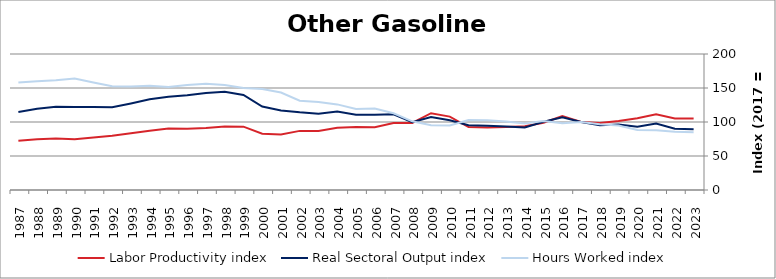
| Category | Labor Productivity index | Real Sectoral Output index | Hours Worked index |
|---|---|---|---|
| 2023.0 | 105.082 | 89.369 | 85.048 |
| 2022.0 | 105.326 | 90.136 | 85.578 |
| 2021.0 | 111.449 | 97.855 | 87.802 |
| 2020.0 | 105.673 | 93.113 | 88.114 |
| 2019.0 | 101.478 | 96.333 | 94.93 |
| 2018.0 | 98.571 | 95.359 | 96.741 |
| 2017.0 | 100 | 100 | 100 |
| 2016.0 | 108.844 | 106.803 | 98.125 |
| 2015.0 | 98.941 | 100.356 | 101.43 |
| 2014.0 | 93.907 | 91.929 | 97.894 |
| 2013.0 | 92.495 | 93.322 | 100.895 |
| 2012.0 | 92.034 | 94.338 | 102.503 |
| 2011.0 | 92.594 | 95.32 | 102.945 |
| 2010.0 | 107.949 | 102.577 | 95.023 |
| 2009.0 | 112.909 | 107.35 | 95.077 |
| 2008.0 | 98.693 | 99.652 | 100.972 |
| 2007.0 | 98.588 | 111.229 | 112.822 |
| 2006.0 | 92.355 | 110.746 | 119.913 |
| 2005.0 | 92.795 | 110.518 | 119.099 |
| 2004.0 | 91.543 | 115.253 | 125.9 |
| 2003.0 | 86.612 | 112.218 | 129.564 |
| 2002.0 | 86.943 | 114.243 | 131.399 |
| 2001.0 | 81.604 | 116.98 | 143.351 |
| 2000.0 | 82.723 | 122.774 | 148.415 |
| 1999.0 | 93.133 | 139.84 | 150.151 |
| 1998.0 | 93.453 | 144.384 | 154.498 |
| 1997.0 | 91.311 | 142.722 | 156.304 |
| 1996.0 | 90.084 | 139.254 | 154.582 |
| 1995.0 | 90.59 | 137.095 | 151.336 |
| 1994.0 | 87.033 | 133.377 | 153.248 |
| 1993.0 | 83.607 | 127.238 | 152.186 |
| 1992.0 | 79.728 | 121.675 | 152.614 |
| 1991.0 | 77.22 | 122.158 | 158.194 |
| 1990.0 | 74.522 | 122.176 | 163.947 |
| 1989.0 | 75.728 | 122.252 | 161.435 |
| 1988.0 | 74.614 | 119.349 | 159.956 |
| 1987.0 | 72.565 | 114.718 | 158.09 |